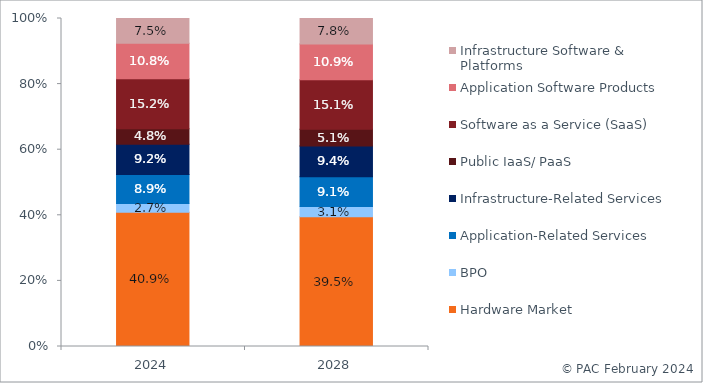
| Category | Hardware Market | BPO | Application-Related Services | Infrastructure-Related Services | Public IaaS/ PaaS | Software as a Service (SaaS) | Application Software Products | Infrastructure Software & Platforms |
|---|---|---|---|---|---|---|---|---|
| 2024.0 | 0.409 | 0.027 | 0.089 | 0.092 | 0.048 | 0.152 | 0.108 | 0.075 |
| 2028.0 | 0.395 | 0.031 | 0.091 | 0.094 | 0.051 | 0.151 | 0.109 | 0.078 |